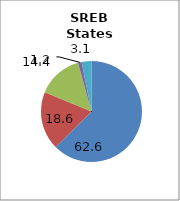
| Category | SREB states |
|---|---|
| White | 62.6 |
| Black | 18.633 |
| Hispanic | 14.444 |
| Two or More Races | 1.206 |
| All Other1 | 3.118 |